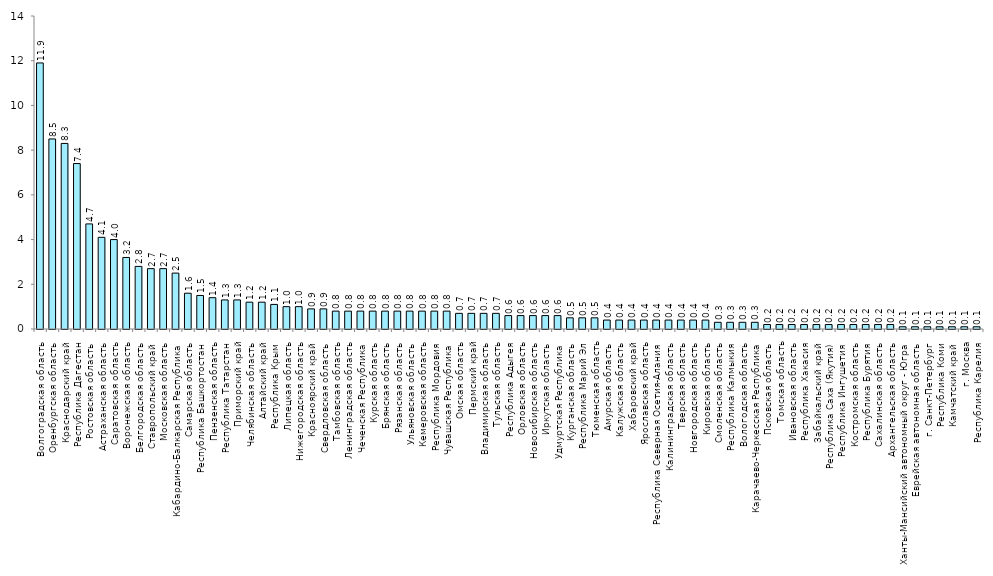
| Category | Series 0 |
|---|---|
| Волгоградская область | 11.9 |
| Оренбургская область | 8.5 |
| Краснодарский край | 8.3 |
| Республика Дагестан | 7.4 |
| Ростовская область | 4.7 |
| Астраханская область | 4.1 |
| Саратовская область | 4 |
| Воронежская область | 3.2 |
| Белгородская область | 2.8 |
| Ставропольский край | 2.7 |
| Московская область | 2.7 |
| Кабардино-Балкарская Республика | 2.5 |
| Самарская область | 1.6 |
| Республика Башкортостан | 1.5 |
| Пензенская область | 1.4 |
| Республика Татарстан | 1.3 |
| Приморский край | 1.3 |
| Челябинская область | 1.2 |
| Алтайский край | 1.2 |
| Республика Крым | 1.1 |
| Липецкая область | 1 |
| Нижегородская область | 1 |
| Красноярский край | 0.9 |
| Свердловская область | 0.9 |
| Тамбовская область | 0.8 |
| Ленинградская область | 0.8 |
| Чеченская Республика | 0.8 |
| Курская область | 0.8 |
| Брянская область | 0.8 |
| Рязанская область | 0.8 |
| Ульяновская область | 0.8 |
| Кемеровская область | 0.8 |
| Республика Мордовия | 0.8 |
| Чувашская Республика | 0.8 |
| Омская область | 0.7 |
| Пермский край | 0.7 |
| Владимирская область | 0.7 |
| Тульская область | 0.7 |
| Республика Адыгея | 0.6 |
| Орловская область | 0.6 |
| Новосибирская область | 0.6 |
| Иркутская область | 0.6 |
| Удмуртская Республика | 0.6 |
| Курганская область | 0.5 |
| Республика Марий Эл | 0.5 |
| Тюменская область | 0.5 |
| Амурская область | 0.4 |
| Калужская область | 0.4 |
| Хабаровский край | 0.4 |
| Ярославская область | 0.4 |
| Республика Северная Осетия-Алания | 0.4 |
| Калининградская область | 0.4 |
| Тверская область | 0.4 |
| Новгородская область | 0.4 |
| Кировская область | 0.4 |
| Смоленская область | 0.3 |
| Республика Калмыкия | 0.3 |
| Вологодская область | 0.3 |
| Карачаево-Черкесская Республика | 0.3 |
| Псковская область | 0.2 |
| Томская область | 0.2 |
| Ивановская область | 0.2 |
| Республика Хакасия | 0.2 |
| Забайкальский край | 0.2 |
| Республика Саха (Якутия) | 0.2 |
| Республика Ингушетия | 0.2 |
| Костромская область | 0.2 |
| Республика Бурятия | 0.2 |
| Сахалинская область | 0.2 |
| Архангельская область | 0.2 |
| Ханты-Мансийский автономный округ - Югра | 0.1 |
| Еврейская автономная область | 0.1 |
| г. Санкт-Петербург | 0.1 |
| Республика Коми | 0.1 |
| Камчатский край | 0.1 |
| г. Москва | 0.1 |
| Республика Карелия | 0.1 |